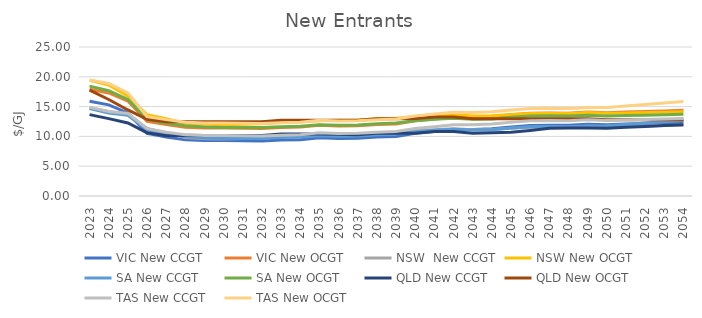
| Category | VIC | NSW  | NSW | SA | QLD | TAS |
|---|---|---|---|---|---|---|
| 2023.0 | 17.896 | 14.832 | 19.423 | 18.437 | 17.749 | 19.467 |
| 2024.0 | 17.286 | 14.129 | 18.63 | 17.671 | 16.194 | 18.871 |
| 2025.0 | 15.937 | 13.757 | 16.756 | 16.186 | 14.436 | 17.283 |
| 2026.0 | 12.514 | 11.342 | 13.625 | 12.872 | 12.866 | 13.302 |
| 2027.0 | 11.986 | 10.563 | 12.96 | 12.188 | 12.452 | 12.813 |
| 2028.0 | 11.539 | 9.793 | 12.188 | 11.8 | 12.447 | 12.366 |
| 2029.0 | 11.41 | 9.624 | 12.018 | 11.572 | 12.444 | 12.237 |
| 2030.0 | 11.419 | 9.57 | 11.962 | 11.498 | 12.446 | 12.246 |
| 2031.0 | 11.384 | 9.641 | 12.032 | 11.499 | 12.446 | 12.211 |
| 2032.0 | 11.336 | 9.744 | 12.133 | 11.505 | 12.451 | 12.163 |
| 2033.0 | 11.48 | 9.928 | 12.316 | 11.634 | 12.712 | 12.307 |
| 2034.0 | 11.557 | 10.074 | 12.46 | 11.707 | 12.712 | 12.384 |
| 2035.0 | 11.865 | 10.261 | 12.646 | 11.938 | 12.718 | 12.692 |
| 2036.0 | 11.765 | 10.325 | 12.709 | 11.871 | 12.719 | 12.592 |
| 2037.0 | 11.781 | 10.363 | 12.745 | 11.897 | 12.723 | 12.608 |
| 2038.0 | 11.985 | 10.571 | 12.952 | 12.127 | 12.975 | 12.812 |
| 2039.0 | 12.101 | 10.654 | 13.033 | 12.243 | 12.975 | 12.928 |
| 2040.0 | 12.61 | 10.948 | 13.326 | 12.629 | 12.987 | 13.437 |
| 2041.0 | 12.912 | 11.136 | 13.513 | 12.884 | 13.256 | 13.739 |
| 2042.0 | 13.226 | 11.281 | 13.657 | 13.051 | 13.272 | 14.053 |
| 2043.0 | 13.191 | 11.123 | 13.44 | 12.858 | 12.959 | 13.998 |
| 2044.0 | 13.322 | 11.153 | 13.469 | 12.923 | 12.959 | 14.13 |
| 2045.0 | 13.614 | 11.365 | 13.68 | 13.2 | 12.957 | 14.422 |
| 2046.0 | 13.868 | 11.521 | 13.835 | 13.431 | 12.96 | 14.676 |
| 2047.0 | 13.926 | 11.548 | 13.855 | 13.47 | 12.959 | 14.709 |
| 2048.0 | 13.902 | 11.524 | 13.826 | 13.423 | 12.967 | 14.664 |
| 2049.0 | 14.094 | 11.716 | 14.011 | 13.548 | 12.972 | 14.833 |
| 2050.0 | 13.984 | 11.615 | 13.872 | 13.42 | 12.786 | 14.854 |
| 2051.0 | 14.081 | 11.686 | 13.939 | 13.49 | 12.789 | 15.097 |
| 2052.0 | 14.179 | 11.757 | 14.006 | 13.56 | 12.792 | 15.343 |
| 2053.0 | 14.278 | 11.829 | 14.073 | 13.631 | 12.795 | 15.593 |
| 2054.0 | 14.377 | 11.901 | 14.14 | 13.702 | 12.798 | 15.848 |